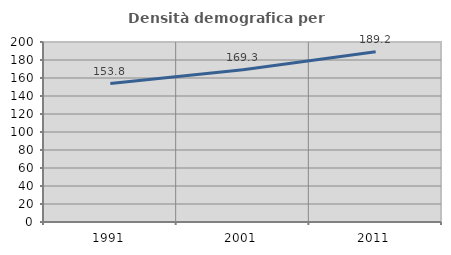
| Category | Densità demografica |
|---|---|
| 1991.0 | 153.761 |
| 2001.0 | 169.283 |
| 2011.0 | 189.177 |